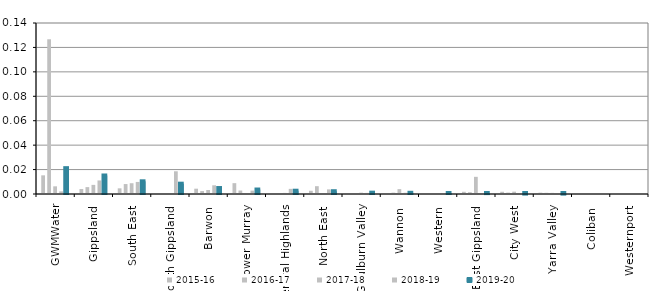
| Category | 2015-16 | 2016-17 | 2017-18 | 2018-19 | 2019-20 |
|---|---|---|---|---|---|
| GWMWater | 0.015 | 0.127 | 0.006 | 0.002 | 0.021 |
| Gippsland  | 0.004 | 0.006 | 0.007 | 0.011 | 0.015 |
| South East  | 0.005 | 0.008 | 0.009 | 0.01 | 0.01 |
| South Gippsland  | 0 | 0.001 | 0 | 0.019 | 0.008 |
| Barwon  | 0.004 | 0.002 | 0.003 | 0.007 | 0.005 |
| Lower Murray  | 0.009 | 0.003 | 0.001 | 0.003 | 0.004 |
| Central Highlands  | 0.001 | 0.001 | 0.001 | 0.004 | 0.003 |
| North East  | 0.003 | 0.006 | 0 | 0.004 | 0.002 |
| Goulburn Valley  | 0 | 0 | 0.001 | 0.001 | 0.001 |
| Wannon  | 0 | 0.001 | 0.004 | 0.001 | 0.001 |
| Western  | 0 | 0 | 0 | 0 | 0.001 |
| East Gippsland  | 0.002 | 0.001 | 0.014 | 0 | 0.001 |
| City West  | 0.002 | 0.001 | 0.002 | 0.001 | 0 |
| Yarra Valley  | 0.001 | 0.001 | 0.001 | 0 | 0 |
| Coliban  | 0 | 0 | 0 | 0 | 0 |
| Westernport  | 0 | 0 | 0 | 0 | 0 |